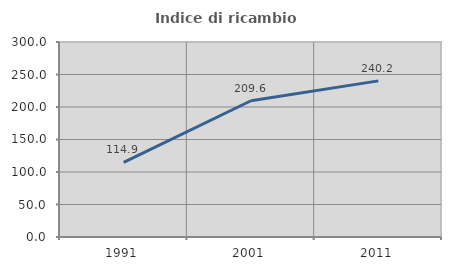
| Category | Indice di ricambio occupazionale  |
|---|---|
| 1991.0 | 114.921 |
| 2001.0 | 209.609 |
| 2011.0 | 240.173 |